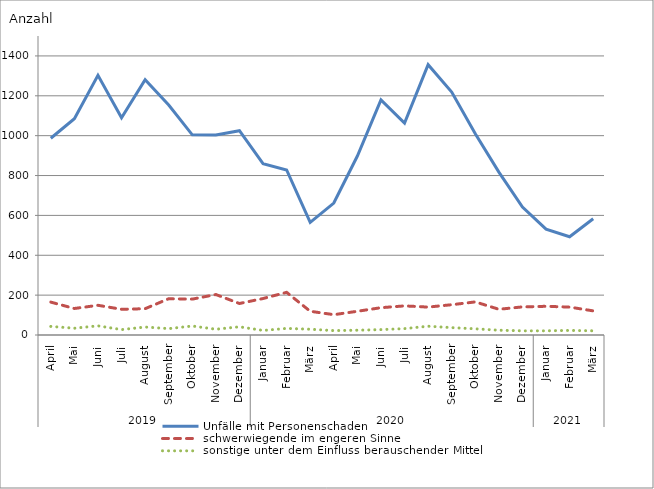
| Category | Unfälle mit Personenschaden | schwerwiegende im engeren Sinne | sonstige unter dem Einfluss berauschender Mittel |
|---|---|---|---|
| 0 | 987 | 165 | 43 |
| 1 | 1085 | 133 | 34 |
| 2 | 1303 | 149 | 46 |
| 3 | 1090 | 129 | 27 |
| 4 | 1281 | 132 | 40 |
| 5 | 1154 | 182 | 32 |
| 6 | 1004 | 180 | 45 |
| 7 | 1003 | 203 | 29 |
| 8 | 1025 | 158 | 41 |
| 9 | 860 | 183 | 23 |
| 10 | 828 | 214 | 33 |
| 11 | 565 | 119 | 29 |
| 12 | 662 | 102 | 22 |
| 13 | 898 | 119 | 24 |
| 14 | 1179 | 137 | 27 |
| 15 | 1063 | 146 | 32 |
| 16 | 1356 | 140 | 44 |
| 17 | 1219 | 152 | 37 |
| 18 | 1010 | 166 | 31 |
| 19 | 817 | 129 | 24 |
| 20 | 642 | 141 | 21 |
| 21 | 531 | 144 | 21 |
| 22 | 493 | 140 | 23 |
| 23 | 583 | 121 | 21 |